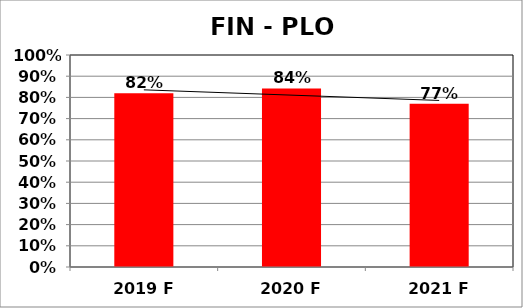
| Category | Series 0 |
|---|---|
| 2019 F | 0.82 |
| 2020 F | 0.842 |
| 2021 F | 0.77 |